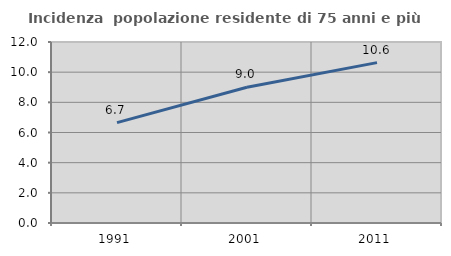
| Category | Incidenza  popolazione residente di 75 anni e più |
|---|---|
| 1991.0 | 6.654 |
| 2001.0 | 9.002 |
| 2011.0 | 10.634 |